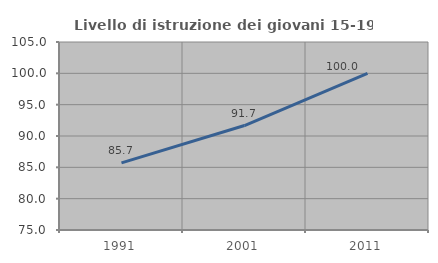
| Category | Livello di istruzione dei giovani 15-19 anni |
|---|---|
| 1991.0 | 85.714 |
| 2001.0 | 91.667 |
| 2011.0 | 100 |